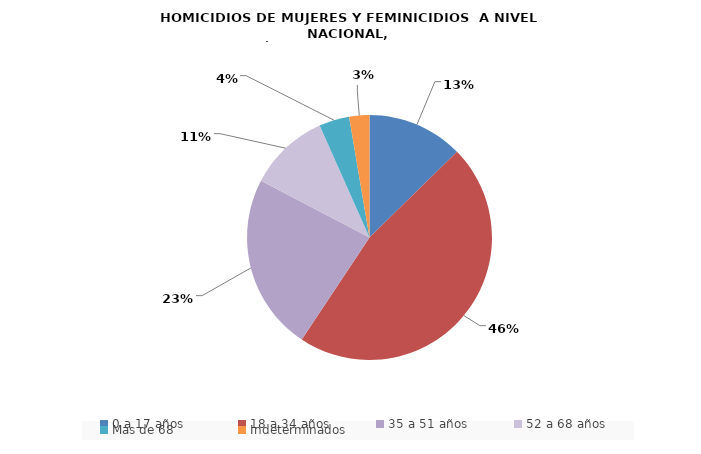
| Category | Series 0 |
|---|---|
| 0 a 17 años | 19 |
| 18 a 34 años | 70 |
| 35 a 51 años | 35 |
| 52 a 68 años | 16 |
| Más de 68 | 6 |
| Indeterminados | 4 |